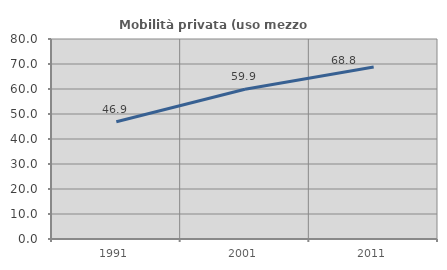
| Category | Mobilità privata (uso mezzo privato) |
|---|---|
| 1991.0 | 46.897 |
| 2001.0 | 59.913 |
| 2011.0 | 68.783 |